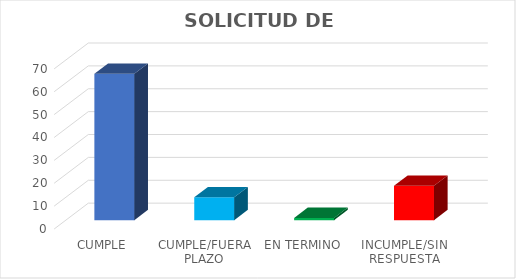
| Category | TOTAL |
|---|---|
| CUMPLE | 64 |
| CUMPLE/FUERA PLAZO | 10 |
| EN TERMINO | 1 |
| INCUMPLE/SIN RESPUESTA | 15 |